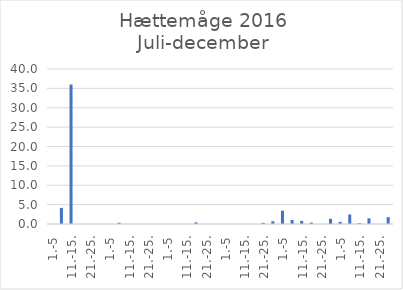
| Category | Series 0 |
|---|---|
| 1.-5 | 0 |
| 6.-10. | 4.162 |
| 11.-15. | 36 |
| 16.-20. | 0 |
| 21.-25. | 0 |
| 26.-31. | 0 |
| 1.-5 | 0 |
| 6.-10. | 0.331 |
| 11.-15. | 0 |
| 16.-20. | 0 |
| 21.-25. | 0 |
| 26.-31. | 0 |
| 1.-5 | 0 |
| 6.-10. | 0 |
| 11.-15. | 0 |
| 16.-20. | 0.42 |
| 21.-25. | 0 |
| 26.-30. | 0 |
| 1.-5 | 0 |
| 6.-10. | 0 |
| 11.-15. | 0 |
| 16.-20. | 0 |
| 21.-25. | 0.295 |
| 26.-31. | 0.719 |
| 1.-5 | 3.429 |
| 6.-10. | 1.053 |
| 11.-15. | 0.802 |
| 16.-20. | 0.377 |
| 21.-25. | 0 |
| 26.-30. | 1.335 |
| 1.-5 | 0.557 |
| 6.-10. | 2.444 |
| 11.-15. | 0.239 |
| 16.-20. | 1.455 |
| 21.-25. | 0 |
| 26.-31. | 1.77 |